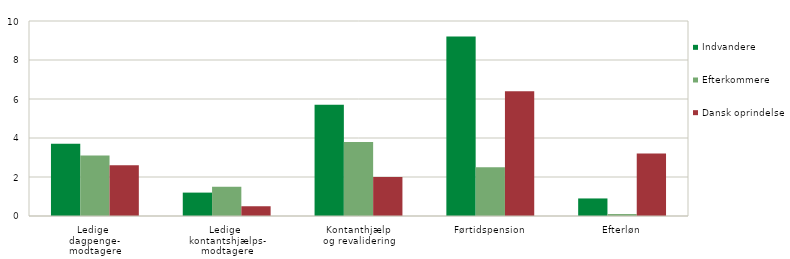
| Category | Indvandere | Efterkommere | Dansk oprindelse |
|---|---|---|---|
| Ledige 
dagpenge-
modtagere | 3.7 | 3.1 | 2.6 |
| Ledige 
kontantshjælps-
modtagere | 1.2 | 1.5 | 0.5 |
| Kontanthjælp 
og revalidering | 5.7 | 3.8 | 2 |
| Førtidspension | 9.2 | 2.5 | 6.4 |
| Efterløn | 0.9 | 0.1 | 3.2 |